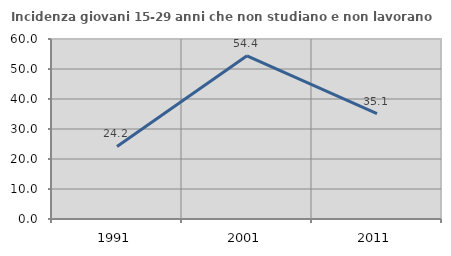
| Category | Incidenza giovani 15-29 anni che non studiano e non lavorano  |
|---|---|
| 1991.0 | 24.173 |
| 2001.0 | 54.386 |
| 2011.0 | 35.088 |